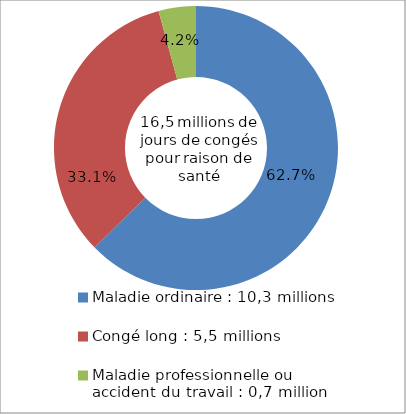
| Category | Series 0 |
|---|---|
| Maladie ordinaire : 10,3 millions | 0.627 |
| Congé long : 5,5 millions | 0.331 |
| Maladie professionnelle ou accident du travail : 0,7 million | 0.042 |